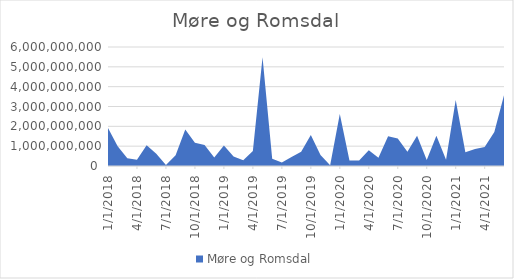
| Category | Møre og Romsdal |
|---|---|
| 1/1/18 | 1920250000 |
| 2/1/18 | 998225000 |
| 3/1/18 | 386925000 |
| 4/1/18 | 317350000 |
| 5/1/18 | 1051300000 |
| 6/1/18 | 619500000 |
| 7/1/18 | 54600000 |
| 8/1/18 | 544837000 |
| 9/1/18 | 1842400000 |
| 10/1/18 | 1173650000 |
| 11/1/18 | 1063400000 |
| 12/1/18 | 433500000 |
| 1/1/19 | 1039750000 |
| 2/1/19 | 482550000 |
| 3/1/19 | 284750000 |
| 4/1/19 | 761000000 |
| 5/1/19 | 5481550000 |
| 6/1/19 | 361050000 |
| 7/1/19 | 175300000 |
| 8/1/19 | 458500000 |
| 9/1/19 | 719550000 |
| 10/1/19 | 1565000000 |
| 11/1/19 | 551850000 |
| 12/1/19 | 41000000 |
| 1/1/20 | 2617500000 |
| 2/1/20 | 280250000 |
| 3/1/20 | 272550000 |
| 4/1/20 | 789500000 |
| 5/1/20 | 416150000 |
| 6/1/20 | 1499300000 |
| 7/1/20 | 1390000000 |
| 8/1/20 | 723550000 |
| 9/1/20 | 1526000000 |
| 10/1/20 | 297950000 |
| 11/1/20 | 1521400000 |
| 12/1/20 | 311500000 |
| 1/1/21 | 3323150000 |
| 2/1/21 | 691900000 |
| 3/1/21 | 855650000 |
| 4/1/21 | 956550000 |
| 5/1/21 | 1711900000 |
| 6/1/21 | 3571250000 |